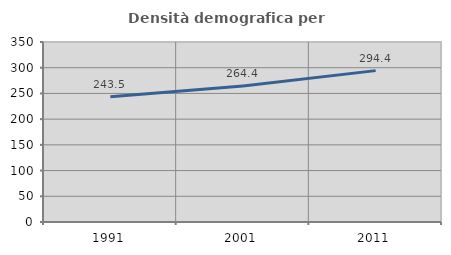
| Category | Densità demografica |
|---|---|
| 1991.0 | 243.545 |
| 2001.0 | 264.433 |
| 2011.0 | 294.356 |